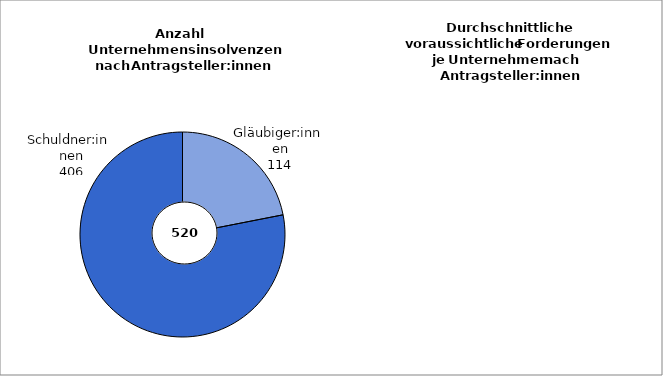
| Category | Series 0 |
|---|---|
| Gläubiger:innen | 114 |
| Schuldner:innen | 406 |